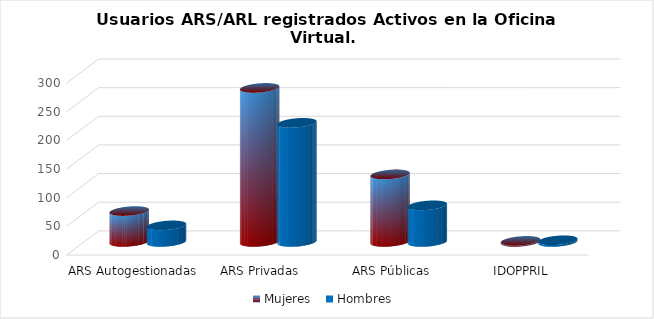
| Category | Mujeres | Hombres |
|---|---|---|
| ARS Autogestionadas | 54 | 29 |
| ARS Privadas | 269 | 208 |
| ARS Públicas | 118 | 64 |
| IDOPPRIL | 2 | 3 |